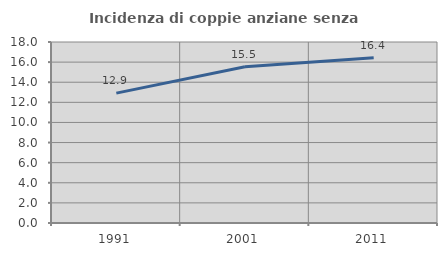
| Category | Incidenza di coppie anziane senza figli  |
|---|---|
| 1991.0 | 12.913 |
| 2001.0 | 15.537 |
| 2011.0 | 16.438 |